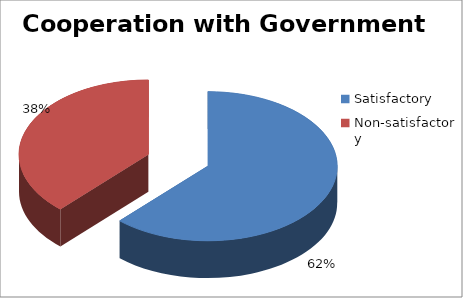
| Category | Series 0 |
|---|---|
| Satisfactory  | 13 |
| Non-satisfactory  | 8 |